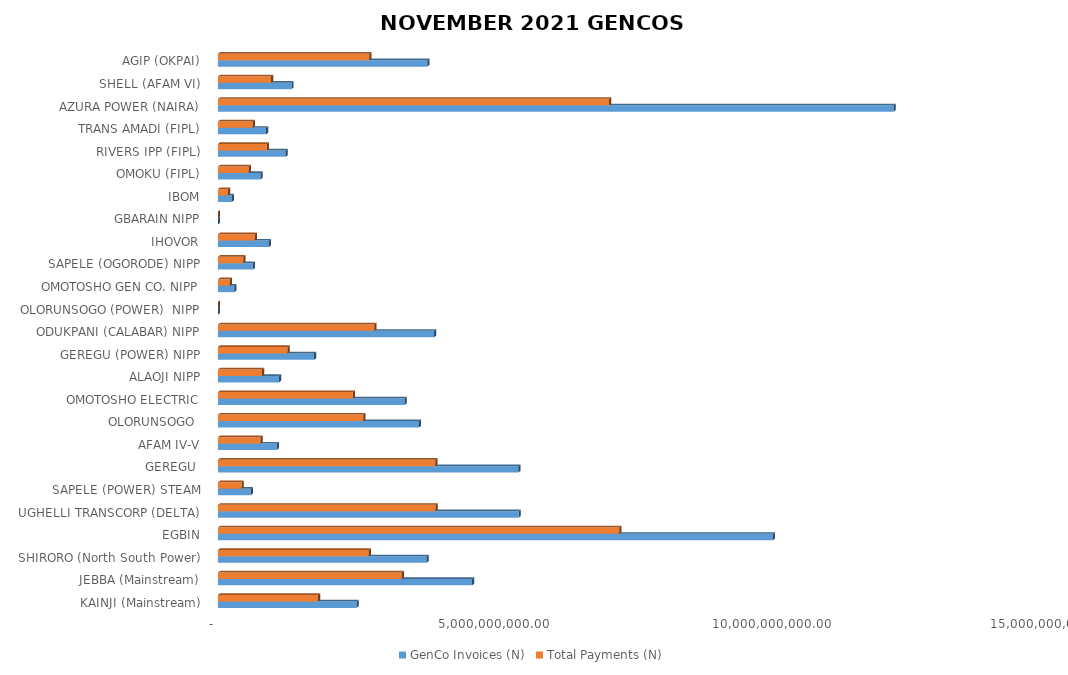
| Category | GenCo Invoices (N) | Total Payments (N) |
|---|---|---|
| KAINJI (Mainstream) | 2495204988.32 | 1805065533.582 |
| JEBBA (Mainstream) | 4577558082.45 | 3311468340.789 |
| SHIRORO (North South Power) | 3757790144.92 | 2718436964.01 |
| EGBIN | 9992698922.58 | 7228855543.752 |
| UGHELLI TRANSCORP (DELTA) | 5416599999.67 | 3918442779 |
| SAPELE (POWER) STEAM | 591670011.04 | 428022206.264 |
| GEREGU  | 5409676297.01 | 3913434077.472 |
| AFAM IV-V | 1059061787.21 | 766139831.788 |
| OLORUNSOGO  | 3619644666.41 | 2618500628.901 |
| OMOTOSHO ELECTRIC | 3360806728.42 | 2431253712.18 |
| ALAOJI NIPP | 1099882486.23 | 795670085.696 |
| GEREGU (POWER) NIPP | 1732682547.37 | 1253446334.685 |
| ODUKPANI (CALABAR) NIPP | 3894004058.17 | 2816975978.3 |
| OLORUNSOGO (POWER)  NIPP | 0 | 0 |
| OMOTOSHO GEN CO. NIPP | 295487083.2 | 213759411.351 |
| SAPELE (OGORODE) NIPP | 630013530.74 | 455760434.655 |
| IHOVOR | 917375580.15 | 663642085.051 |
| GBARAIN NIPP | 0 | 0 |
| IBOM | 250448101.9 | 181177594.148 |
| OMOKU (FIPL) | 768030644.21 | 555603908.732 |
| RIVERS IPP (FIPL) | 1219610178.14 | 882282741.206 |
| TRANS AMADI (FIPL) | 868014544.58 | 627933634.472 |
| AZURA POWER (NAIRA) | 12166820539.588 | 7045444766.591 |
| SHELL (AFAM VI) | 1323838308.876 | 957682801.442 |
| AGIP (OKPAI) | 3769967261.833 | 2727246057.507 |